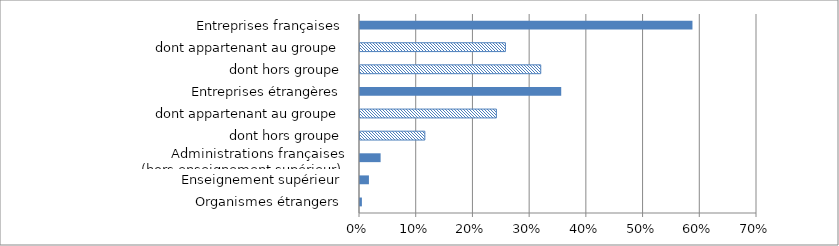
| Category | Series 0 |
|---|---|
| Organismes étrangers | 0.003 |
| Enseignement supérieur | 0.016 |
| Administrations françaises (hors enseignement supérieur) | 0.036 |
| dont hors groupe | 0.114 |
| dont appartenant au groupe | 0.24 |
| Entreprises étrangères | 0.355 |
| dont hors groupe | 0.319 |
| dont appartenant au groupe | 0.256 |
| Entreprises françaises | 0.586 |